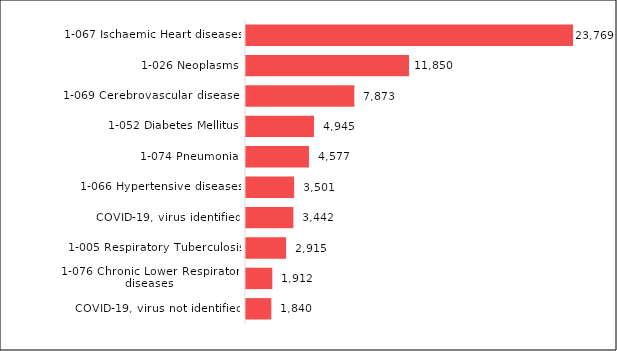
| Category | Series 0 |
|---|---|
| COVID-19, virus not identified | 1840 |
| 1-076 Chronic Lower Respiratory diseases | 1912 |
| 1-005 Respiratory Tuberculosis | 2915 |
| COVID-19, virus identified | 3442 |
| 1-066 Hypertensive diseases | 3501 |
| 1-074 Pneumonia | 4577 |
| 1-052 Diabetes Mellitus | 4945 |
| 1-069 Cerebrovascular diseases | 7873 |
| 1-026 Neoplasms | 11850 |
| 1-067 Ischaemic Heart diseases | 23769 |